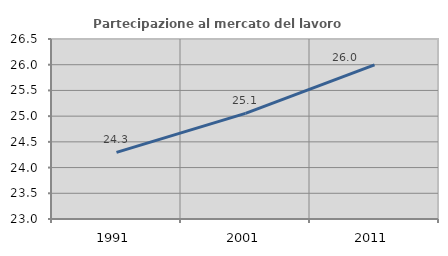
| Category | Partecipazione al mercato del lavoro  femminile |
|---|---|
| 1991.0 | 24.295 |
| 2001.0 | 25.054 |
| 2011.0 | 25.997 |